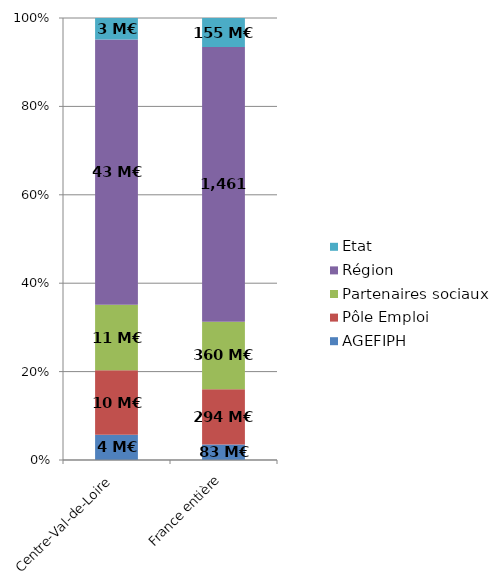
| Category | AGEFIPH | Pôle Emploi | Partenaires sociaux | Région | Etat |
|---|---|---|---|---|---|
| Centre-Val-de-Loire | 4.055 | 10.4 | 10.579 | 42.762 | 3.454 |
| France entière | 82.716 | 293.959 | 359.593 | 1461.057 | 154.74 |